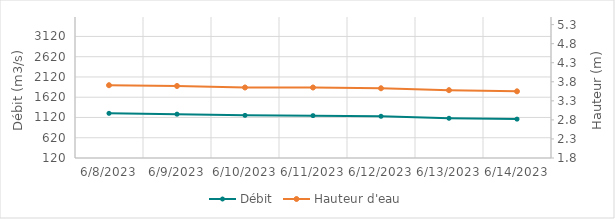
| Category | Débit |
|---|---|
| 5/11/23 | 1989.29 |
| 5/10/23 | 2025.65 |
| 5/9/23 | 2028.7 |
| 5/8/23 | 1903.33 |
| 5/7/23 | 1668.28 |
| 5/6/23 | 1382.92 |
| 5/5/23 | 1313.48 |